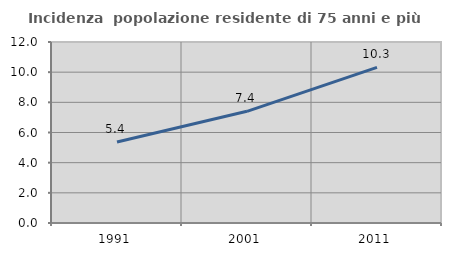
| Category | Incidenza  popolazione residente di 75 anni e più |
|---|---|
| 1991.0 | 5.366 |
| 2001.0 | 7.403 |
| 2011.0 | 10.322 |